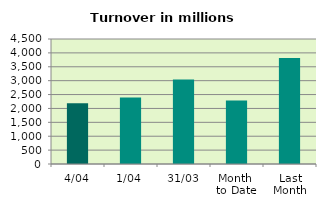
| Category | Series 0 |
|---|---|
| 4/04 | 2187.769 |
| 1/04 | 2389.711 |
| 31/03 | 3038.312 |
| Month 
to Date | 2288.74 |
| Last
Month | 3816.191 |